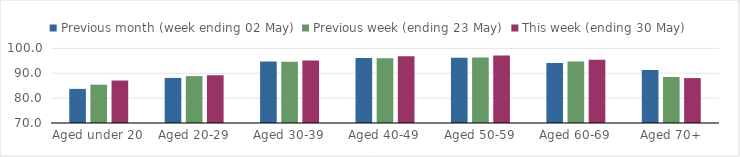
| Category | Previous month (week ending 02 May) | Previous week (ending 23 May) | This week (ending 30 May) |
|---|---|---|---|
| Aged under 20 | 83.718 | 85.421 | 87.088 |
| Aged 20-29 | 88.139 | 88.849 | 89.214 |
| Aged 30-39 | 94.709 | 94.66 | 95.169 |
| Aged 40-49 | 96.132 | 96.06 | 96.804 |
| Aged 50-59 | 96.22 | 96.339 | 97.181 |
| Aged 60-69 | 94.146 | 94.699 | 95.443 |
| Aged 70+ | 91.362 | 88.514 | 88.07 |